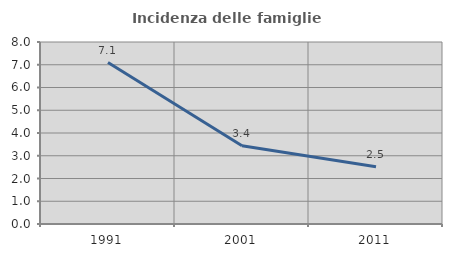
| Category | Incidenza delle famiglie numerose |
|---|---|
| 1991.0 | 7.098 |
| 2001.0 | 3.442 |
| 2011.0 | 2.513 |